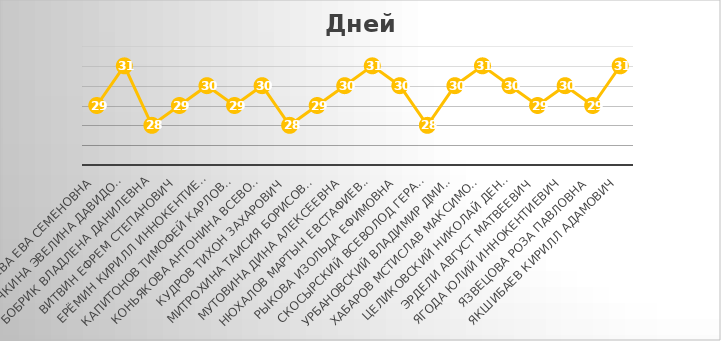
| Category | Series 0 |
|---|---|
| Ануфриева Ева Семеновна | 29 |
| Белочкина Эвелина Давидовна | 31 |
| Бобрик Владлена Данилевна | 28 |
| Витвин Ефрем Степанович | 29 |
| Ерёмин Кирилл Иннокентиевич | 30 |
| Капитонов Тимофей Карлович | 29 |
| Коньякова Антонина Всеволодовна | 30 |
| Кудров Тихон Захарович | 28 |
| Митрохина Таисия Борисовна | 29 |
| Мутовина Дина Алексеевна | 30 |
| Нюхалов Мартын Евстафиевич | 31 |
| Рыкова Изольда Ефимовна | 30 |
| Скосырский Всеволод Герасимович | 28 |
| Урбановский Владимир Дмитриевич | 30 |
| Хабаров Мстислав Максимович | 31 |
| Целиковский Николай Денисович | 30 |
| Эрдели ﻿Август Матвеевич | 29 |
| Ягода Юлий Иннокентиевич | 30 |
| Язвецова Роза Павловна | 29 |
| Якшибаев Кирилл Адамович | 31 |